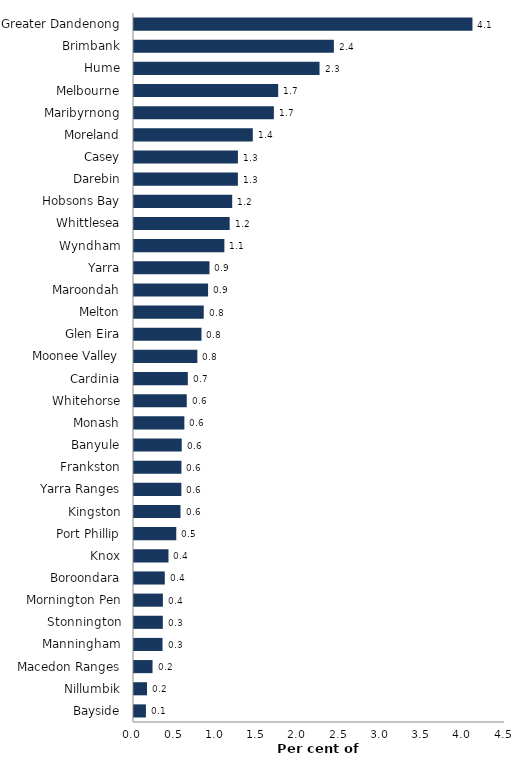
| Category | Series 0 |
|---|---|
| Bayside | 0.144 |
| Nillumbik | 0.157 |
| Macedon Ranges | 0.225 |
| Manningham | 0.346 |
| Stonnington | 0.35 |
| Mornington Pen | 0.35 |
| Boroondara | 0.374 |
| Knox | 0.418 |
| Port Phillip | 0.513 |
| Kingston | 0.564 |
| Yarra Ranges | 0.574 |
| Frankston | 0.575 |
| Banyule | 0.579 |
| Monash | 0.611 |
| Whitehorse | 0.64 |
| Cardinia | 0.653 |
| Moonee Valley | 0.769 |
| Glen Eira | 0.819 |
| Melton | 0.846 |
| Maroondah | 0.899 |
| Yarra | 0.916 |
| Wyndham | 1.096 |
| Whittlesea | 1.161 |
| Hobsons Bay | 1.191 |
| Darebin | 1.26 |
| Casey | 1.26 |
| Moreland | 1.441 |
| Maribyrnong | 1.697 |
| Melbourne | 1.749 |
| Hume | 2.25 |
| Brimbank | 2.424 |
| Greater Dandenong | 4.105 |